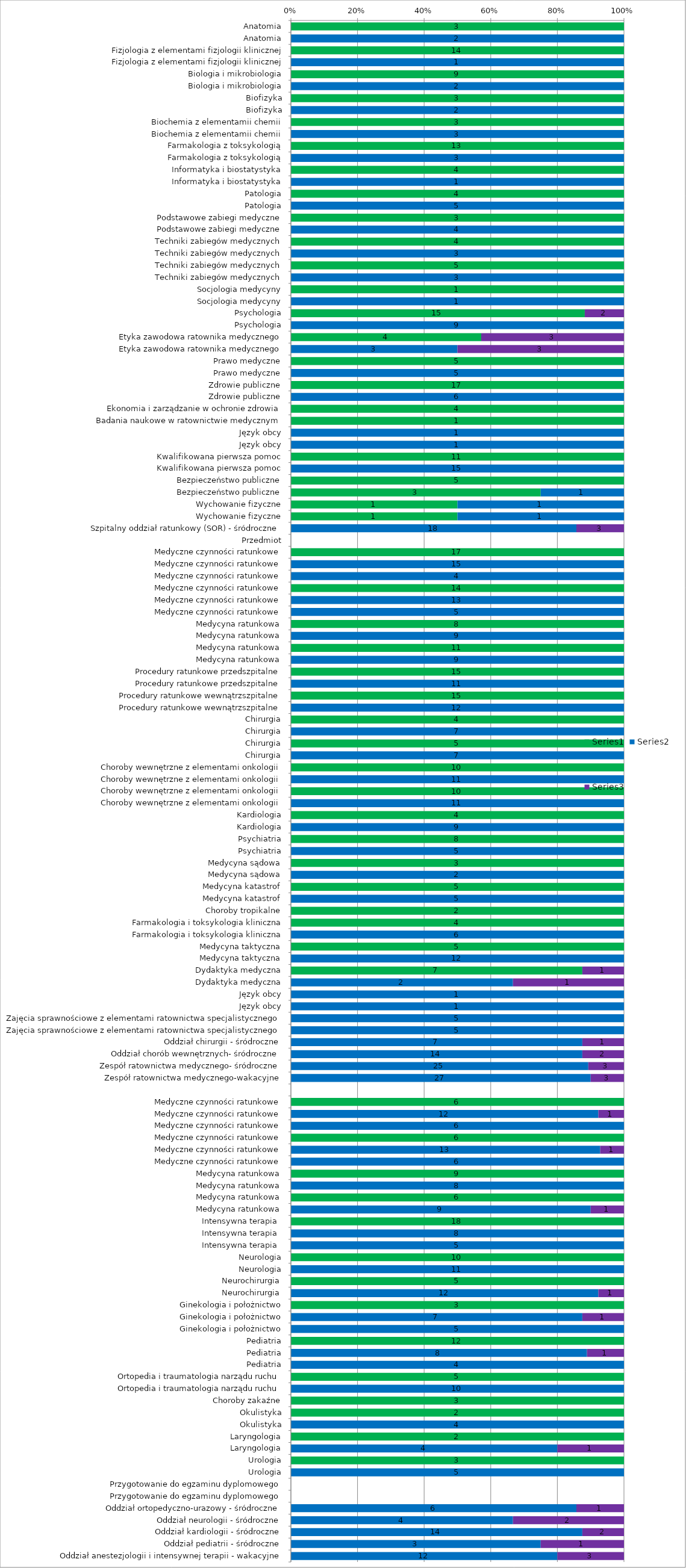
| Category | Series 0 | Series 1 | Series 2 |
|---|---|---|---|
| Anatomia | 3 | 0 | 0 |
| Anatomia | 0 | 2 | 0 |
| Fizjologia z elementami fizjologii klinicznej | 14 | 0 | 0 |
| Fizjologia z elementami fizjologii klinicznej | 0 | 1 | 0 |
| Biologia i mikrobiologia | 9 | 0 | 0 |
| Biologia i mikrobiologia | 0 | 2 | 0 |
| Biofizyka | 3 | 0 | 0 |
| Biofizyka | 0 | 2 | 0 |
| Biochemia z elementamii chemii | 3 | 0 | 0 |
| Biochemia z elementamii chemii | 0 | 3 | 0 |
| Farmakologia z toksykologią | 13 | 0 | 0 |
| Farmakologia z toksykologią | 0 | 3 | 0 |
| Informatyka i biostatystyka | 4 | 0 | 0 |
| Informatyka i biostatystyka | 0 | 1 | 0 |
| Patologia | 4 | 0 | 0 |
| Patologia | 0 | 5 | 0 |
| Podstawowe zabiegi medyczne | 3 | 0 | 0 |
| Podstawowe zabiegi medyczne | 0 | 4 | 0 |
| Techniki zabiegów medycznych | 4 | 0 | 0 |
| Techniki zabiegów medycznych | 0 | 3 | 0 |
| Techniki zabiegów medycznych | 5 | 0 | 0 |
| Techniki zabiegów medycznych | 0 | 3 | 0 |
| Socjologia medycyny | 1 | 0 | 0 |
| Socjologia medycyny | 0 | 1 | 0 |
| Psychologia | 15 | 0 | 2 |
| Psychologia | 0 | 9 | 0 |
| Etyka zawodowa ratownika medycznego | 4 | 0 | 3 |
| Etyka zawodowa ratownika medycznego | 0 | 3 | 3 |
| Prawo medyczne | 5 | 0 | 0 |
| Prawo medyczne | 0 | 5 | 0 |
| Zdrowie publiczne | 17 | 0 | 0 |
| Zdrowie publiczne | 0 | 6 | 0 |
| Ekonomia i zarządzanie w ochronie zdrowia | 4 | 0 | 0 |
| Badania naukowe w ratownictwie medycznym | 1 | 0 | 0 |
| Język obcy | 0 | 1 | 0 |
| Język obcy | 0 | 1 | 0 |
| Kwalifikowana pierwsza pomoc | 11 | 0 | 0 |
| Kwalifikowana pierwsza pomoc | 0 | 15 | 0 |
| Bezpieczeństwo publiczne | 5 | 0 | 0 |
| Bezpieczeństwo publiczne | 3 | 1 | 0 |
| Wychowanie fizyczne | 1 | 1 | 0 |
| Wychowanie fizyczne | 1 | 1 | 0 |
| Szpitalny oddział ratunkowy (SOR) - śródroczne | 0 | 18 | 3 |
| Przedmiot | 0 | 0 | 0 |
| Medyczne czynności ratunkowe | 17 | 0 | 0 |
| Medyczne czynności ratunkowe | 0 | 15 | 0 |
| Medyczne czynności ratunkowe | 0 | 4 | 0 |
| Medyczne czynności ratunkowe | 14 | 0 | 0 |
| Medyczne czynności ratunkowe | 0 | 13 | 0 |
| Medyczne czynności ratunkowe | 0 | 5 | 0 |
| Medycyna ratunkowa | 8 | 0 | 0 |
| Medycyna ratunkowa | 0 | 9 | 0 |
| Medycyna ratunkowa | 11 | 0 | 0 |
| Medycyna ratunkowa | 0 | 9 | 0 |
| Procedury ratunkowe przedszpitalne | 15 | 0 | 0 |
| Procedury ratunkowe przedszpitalne | 0 | 11 | 0 |
| Procedury ratunkowe wewnątrzszpitalne | 15 | 0 | 0 |
| Procedury ratunkowe wewnątrzszpitalne | 0 | 12 | 0 |
| Chirurgia | 4 | 0 | 0 |
| Chirurgia | 0 | 7 | 0 |
| Chirurgia | 5 | 0 | 0 |
| Chirurgia | 0 | 7 | 0 |
| Choroby wewnętrzne z elementami onkologii | 10 | 0 | 0 |
| Choroby wewnętrzne z elementami onkologii | 0 | 11 | 0 |
| Choroby wewnętrzne z elementami onkologii | 10 | 0 | 0 |
| Choroby wewnętrzne z elementami onkologii | 0 | 11 | 0 |
| Kardiologia | 4 | 0 | 0 |
| Kardiologia | 0 | 9 | 0 |
| Psychiatria | 8 | 0 | 0 |
| Psychiatria | 0 | 5 | 0 |
| Medycyna sądowa | 3 | 0 | 0 |
| Medycyna sądowa | 0 | 2 | 0 |
| Medycyna katastrof | 5 | 0 | 0 |
| Medycyna katastrof | 0 | 5 | 0 |
| Choroby tropikalne | 2 | 0 | 0 |
| Farmakologia i toksykologia kliniczna | 4 | 0 | 0 |
| Farmakologia i toksykologia kliniczna | 0 | 6 | 0 |
| Medycyna taktyczna | 5 | 0 | 0 |
| Medycyna taktyczna | 0 | 12 | 0 |
| Dydaktyka medyczna | 7 | 0 | 1 |
| Dydaktyka medyczna | 0 | 2 | 1 |
| Język obcy | 0 | 1 | 0 |
| Język obcy | 0 | 1 | 0 |
| Zajęcia sprawnościowe z elementami ratownictwa specjalistycznego | 0 | 5 | 0 |
| Zajęcia sprawnościowe z elementami ratownictwa specjalistycznego | 0 | 5 | 0 |
| Oddział chirurgii - śródroczne | 0 | 7 | 1 |
| Oddział chorób wewnętrznych- śródroczne | 0 | 14 | 2 |
| Zespół ratownictwa medycznego- śródroczne | 0 | 25 | 3 |
| Zespół ratownictwa medycznego-wakacyjne | 0 | 27 | 3 |
|  | 0 | 0 | 0 |
| Medyczne czynności ratunkowe | 6 | 0 | 0 |
| Medyczne czynności ratunkowe | 0 | 12 | 1 |
| Medyczne czynności ratunkowe | 0 | 6 | 0 |
| Medyczne czynności ratunkowe | 6 | 0 | 0 |
| Medyczne czynności ratunkowe | 0 | 13 | 1 |
| Medyczne czynności ratunkowe | 0 | 6 | 0 |
| Medycyna ratunkowa | 9 | 0 | 0 |
| Medycyna ratunkowa | 0 | 8 | 0 |
| Medycyna ratunkowa | 6 | 0 | 0 |
| Medycyna ratunkowa | 0 | 9 | 1 |
| Intensywna terapia  | 18 | 0 | 0 |
| Intensywna terapia  | 0 | 8 | 0 |
| Intensywna terapia  | 0 | 5 | 0 |
| Neurologia | 10 | 0 | 0 |
| Neurologia | 0 | 11 | 0 |
| Neurochirurgia | 5 | 0 | 0 |
| Neurochirurgia | 0 | 12 | 1 |
| Ginekologia i położnictwo | 3 | 0 | 0 |
| Ginekologia i położnictwo | 0 | 7 | 1 |
| Ginekologia i położnictwo | 0 | 5 | 0 |
| Pediatria | 12 | 0 | 0 |
| Pediatria | 0 | 8 | 1 |
| Pediatria | 0 | 4 | 0 |
| Ortopedia i traumatologia narządu ruchu | 5 | 0 | 0 |
| Ortopedia i traumatologia narządu ruchu | 0 | 10 | 0 |
| Choroby zakaźne | 3 | 0 | 0 |
| Okulistyka | 2 | 0 | 0 |
| Okulistyka | 0 | 4 | 0 |
| Laryngologia | 2 | 0 | 0 |
| Laryngologia | 0 | 4 | 1 |
| Urologia | 3 | 0 | 0 |
| Urologia | 0 | 5 | 0 |
| Przygotowanie do egzaminu dyplomowego | 0 | 0 | 0 |
| Przygotowanie do egzaminu dyplomowego | 0 | 0 | 0 |
| Oddział ortopedyczno-urazowy - śródroczne | 0 | 6 | 1 |
| Oddział neurologii - śródroczne | 0 | 4 | 2 |
| Oddział kardiologii - śródroczne | 0 | 14 | 2 |
| Oddział pediatrii - śródroczne | 0 | 3 | 1 |
| Oddział anestezjologii i intensywnej terapii - wakacyjne | 0 | 12 | 3 |